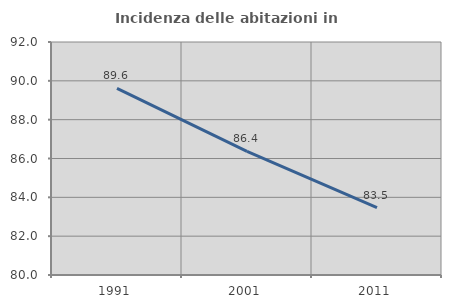
| Category | Incidenza delle abitazioni in proprietà  |
|---|---|
| 1991.0 | 89.607 |
| 2001.0 | 86.364 |
| 2011.0 | 83.471 |